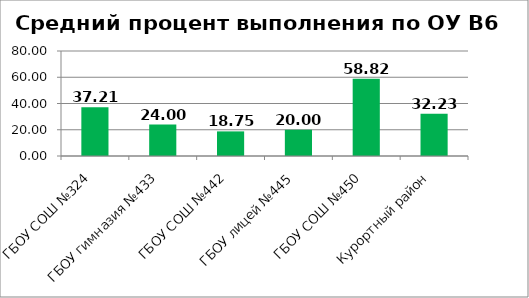
| Category | B6 |
|---|---|
| ГБОУ СОШ №324 | 37.209 |
| ГБОУ гимназия №433 | 24 |
| ГБОУ СОШ №442 | 18.75 |
| ГБОУ лицей №445 | 20 |
| ГБОУ СОШ №450 | 58.824 |
| Курортный район | 32.231 |